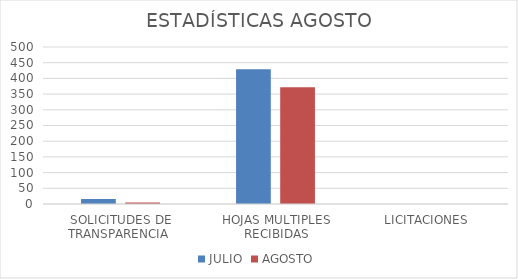
| Category | JULIO | AGOSTO |
|---|---|---|
| SOLICITUDES DE TRANSPARENCIA  | 16 | 5 |
| HOJAS MULTIPLES RECIBIDAS | 429 | 372 |
| LICITACIONES  | 0 | 0 |